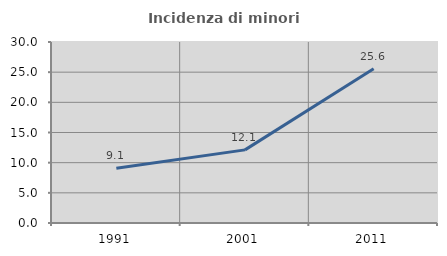
| Category | Incidenza di minori stranieri |
|---|---|
| 1991.0 | 9.091 |
| 2001.0 | 12.121 |
| 2011.0 | 25.581 |